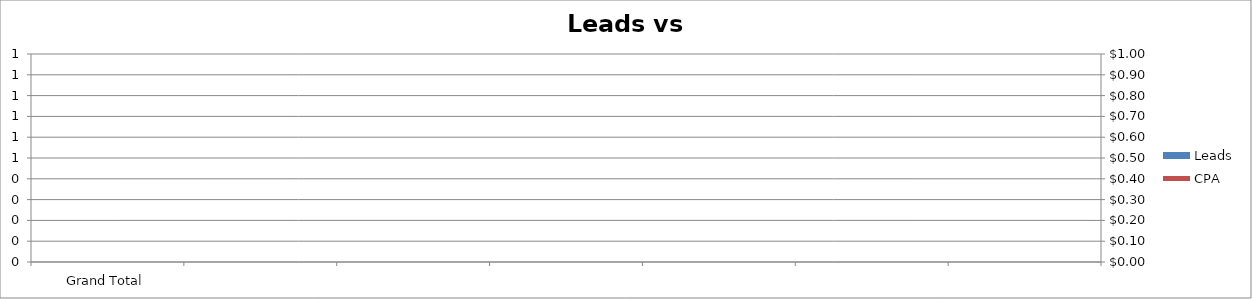
| Category | Leads |
|---|---|
| Grand Total | 0 |